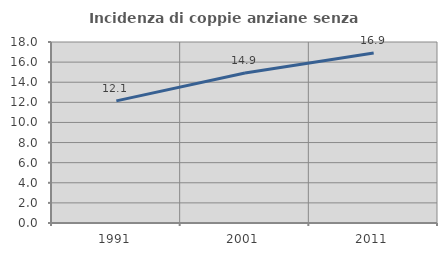
| Category | Incidenza di coppie anziane senza figli  |
|---|---|
| 1991.0 | 12.147 |
| 2001.0 | 14.919 |
| 2011.0 | 16.9 |